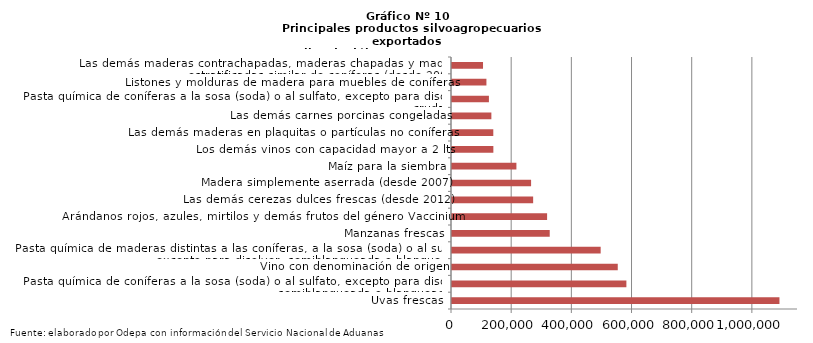
| Category | Series 0 |
|---|---|
| Uvas frescas | 1088377.436 |
| Pasta química de coníferas a la sosa (soda) o al sulfato, excepto para disolver, semiblanqueada o blanqueada | 579596.82 |
| Vino con denominación de origen | 550934.254 |
| Pasta química de maderas distintas a las coníferas, a la sosa (soda) o al sulfato, excepto para disolver, semiblanqueada o blanqueada | 494135.611 |
| Manzanas frescas | 324821.492 |
| Arándanos rojos, azules, mirtilos y demás frutos del género Vaccinium | 316073.497 |
| Las demás cerezas dulces frescas (desde 2012) | 269704.108 |
| Madera simplemente aserrada (desde 2007) | 262860.552 |
| Maíz para la siembra | 214074.525 |
| Los demás vinos con capacidad mayor a 2 lts | 137465.608 |
| Las demás maderas en plaquitas o partículas no coníferas | 137257.23 |
| Las demás carnes porcinas congeladas | 130851.057 |
| Pasta química de coníferas a la sosa (soda) o al sulfato, excepto para disolver, cruda | 122679.233 |
| Listones y molduras de madera para muebles de coníferas | 114395.125 |
| Las demás maderas contrachapadas, maderas chapadas y maderas estratificadas similar de coníferas (desde 2007) | 103101.879 |